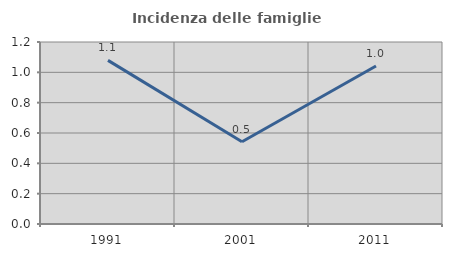
| Category | Incidenza delle famiglie numerose |
|---|---|
| 1991.0 | 1.079 |
| 2001.0 | 0.543 |
| 2011.0 | 1.042 |